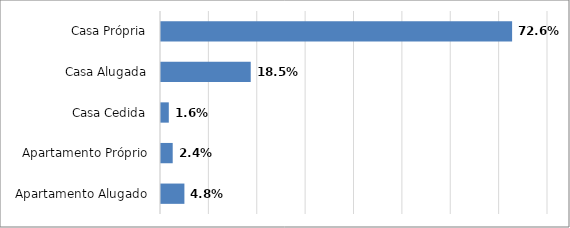
| Category | Series 0 |
|---|---|
| Apartamento Alugado | 0.048 |
| Apartamento Próprio | 0.024 |
| Casa Cedida | 0.016 |
| Casa Alugada | 0.185 |
| Casa Própria | 0.726 |